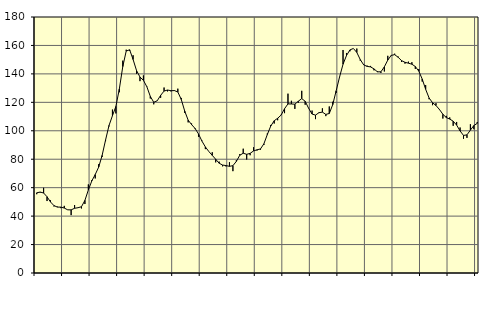
| Category | Piggar | Series 1 |
|---|---|---|
| nan | 55.4 | 56.39 |
| 87.0 | 56.6 | 56.91 |
| 87.0 | 59.9 | 56.26 |
| 87.0 | 50.6 | 53.62 |
| nan | 51.1 | 49.95 |
| 88.0 | 46.8 | 47.41 |
| 88.0 | 46.7 | 46.33 |
| 88.0 | 45.6 | 46.34 |
| nan | 47.2 | 45.67 |
| 89.0 | 44.5 | 44.42 |
| 89.0 | 40.7 | 44.4 |
| 89.0 | 47.8 | 45.5 |
| nan | 45.9 | 45.91 |
| 90.0 | 45.4 | 46.6 |
| 90.0 | 48.5 | 51.06 |
| 90.0 | 62.3 | 58.38 |
| nan | 65.3 | 64.73 |
| 91.0 | 66.5 | 69.23 |
| 91.0 | 76.5 | 74.47 |
| 91.0 | 81.6 | 82.65 |
| nan | 92.7 | 93.49 |
| 92.0 | 103.1 | 103.71 |
| 92.0 | 114.9 | 110.58 |
| 92.0 | 112.2 | 117.12 |
| nan | 127.1 | 129.34 |
| 93.0 | 149.3 | 145.12 |
| 93.0 | 157 | 156.05 |
| 93.0 | 156.2 | 156.95 |
| nan | 153.1 | 150.15 |
| 94.0 | 140.1 | 142.36 |
| 94.0 | 134.9 | 137.77 |
| 94.0 | 138.9 | 135.47 |
| nan | 131.2 | 130.95 |
| 95.0 | 122.7 | 124.18 |
| 95.0 | 118.6 | 120.04 |
| 95.0 | 121.2 | 121.05 |
| nan | 123.2 | 124.92 |
| 96.0 | 130.4 | 127.93 |
| 96.0 | 127.7 | 128.65 |
| 96.0 | 127.7 | 128.18 |
| nan | 128.5 | 128.27 |
| 97.0 | 129.6 | 127.27 |
| 97.0 | 123.1 | 122.01 |
| 97.0 | 112.6 | 113.82 |
| nan | 105.9 | 107.49 |
| 98.0 | 105.1 | 104.32 |
| 98.0 | 101.2 | 101.66 |
| 98.0 | 95.8 | 97.81 |
| nan | 93.1 | 92.74 |
| 99.0 | 87.1 | 88.65 |
| 99.0 | 85.4 | 85.44 |
| 99.0 | 84.9 | 82.71 |
| nan | 77.8 | 79.97 |
| 0.0 | 78.3 | 77.17 |
| 0.0 | 75 | 75.92 |
| 0.0 | 74.9 | 75.54 |
| nan | 77.9 | 75.01 |
| 1.0 | 71.6 | 75.46 |
| 1.0 | 79.3 | 78.49 |
| 1.0 | 83.6 | 82.79 |
| nan | 87.4 | 84.22 |
| 2.0 | 79.8 | 83.45 |
| 2.0 | 82.8 | 84.12 |
| 2.0 | 88.4 | 85.82 |
| nan | 86.1 | 86.63 |
| 3.0 | 86.7 | 87.21 |
| 3.0 | 90 | 90.83 |
| 3.0 | 98.1 | 97.35 |
| nan | 104.1 | 103.37 |
| 4.0 | 105.1 | 107.06 |
| 4.0 | 107.4 | 108.79 |
| 4.0 | 111.2 | 111.02 |
| nan | 112.4 | 115.52 |
| 5.0 | 126.1 | 118.89 |
| 5.0 | 121.1 | 118.83 |
| 5.0 | 115.4 | 118.69 |
| nan | 119.7 | 120.77 |
| 6.0 | 128.1 | 122.64 |
| 6.0 | 118.3 | 120.72 |
| 6.0 | 115.7 | 115.81 |
| nan | 114.2 | 111.76 |
| 7.0 | 108.2 | 111.02 |
| 7.0 | 112.5 | 112.71 |
| 7.0 | 115.8 | 113.11 |
| nan | 110.3 | 111.52 |
| 8.0 | 117.1 | 112.15 |
| 8.0 | 120.4 | 118.35 |
| 8.0 | 126.6 | 128.09 |
| nan | 137.8 | 137.94 |
| 9.0 | 156.8 | 146.8 |
| 9.0 | 154.7 | 152.89 |
| 9.0 | 155.9 | 156.86 |
| nan | 157.9 | 157.88 |
| 10.0 | 157.8 | 155.08 |
| 10.0 | 149.3 | 150.07 |
| 10.0 | 146.7 | 146.32 |
| nan | 145.8 | 145.27 |
| 11.0 | 145.6 | 144.92 |
| 11.0 | 142.5 | 143.49 |
| 11.0 | 141.9 | 141.43 |
| nan | 140.7 | 141.47 |
| 12.0 | 141.7 | 144.96 |
| 12.0 | 152.7 | 149.72 |
| 12.0 | 152.7 | 153.02 |
| nan | 154.2 | 153.52 |
| 13.0 | 152.2 | 151.69 |
| 13.0 | 148.4 | 149.34 |
| 13.0 | 147.2 | 148.13 |
| nan | 148.6 | 147.53 |
| 14.0 | 148.2 | 146.81 |
| 14.0 | 143.5 | 145.19 |
| 14.0 | 143.4 | 141.95 |
| nan | 134.6 | 136.39 |
| 15.0 | 132.1 | 129.17 |
| 15.0 | 122.2 | 123.08 |
| 15.0 | 118 | 119.75 |
| nan | 119.4 | 117.77 |
| 16.0 | 114.7 | 115.01 |
| 16.0 | 108.6 | 111.62 |
| 16.0 | 110.5 | 109.29 |
| nan | 109.4 | 108.22 |
| 17.0 | 103.5 | 106.74 |
| 17.0 | 106.2 | 103.99 |
| 17.0 | 102.3 | 99.91 |
| nan | 94.4 | 96.73 |
| 18.0 | 95 | 97.14 |
| 18.0 | 104.6 | 100.45 |
| 18.0 | 101.1 | 103.68 |
| nan | 106.2 | 105.23 |